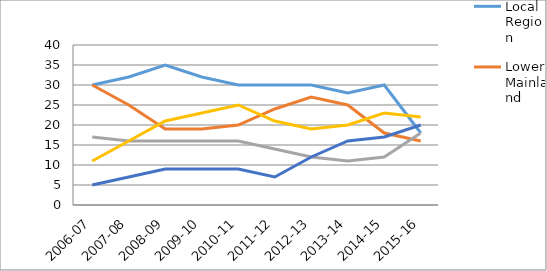
| Category | Local Region  | Lower Mainland | Rest of BC | Rest of Canada | Rest of World |
|---|---|---|---|---|---|
| 2006-07 | 30 | 30 | 17 | 11 | 5 |
| 2007-08 | 32 | 25 | 16 | 16 | 7 |
| 2008-09 | 35 | 19 | 16 | 21 | 9 |
| 2009-10 | 32 | 19 | 16 | 23 | 9 |
| 2010-11 | 30 | 20 | 16 | 25 | 9 |
| 2011-12 | 30 | 24 | 14 | 21 | 7 |
| 2012-13 | 30 | 27 | 12 | 19 | 12 |
| 2013-14 | 28 | 25 | 11 | 20 | 16 |
| 2014-15 | 30 | 18 | 12 | 23 | 17 |
| 2015-16 | 18 | 16 | 18 | 22 | 20 |